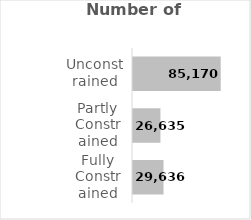
| Category | Series 0 |
|---|---|
| Fully Constrained | 29635.686 |
| Partly Constrained | 26634.683 |
| Unconstrained | 85170.151 |